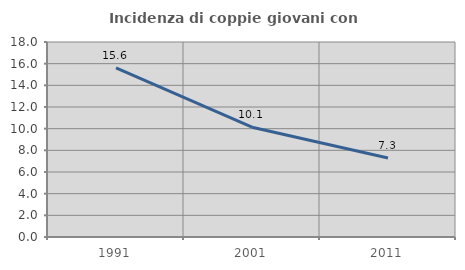
| Category | Incidenza di coppie giovani con figli |
|---|---|
| 1991.0 | 15.618 |
| 2001.0 | 10.138 |
| 2011.0 | 7.291 |